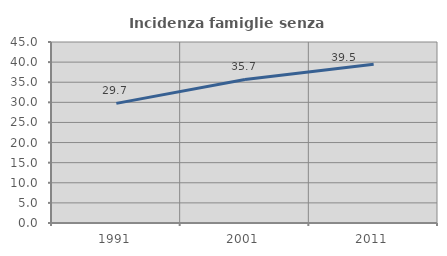
| Category | Incidenza famiglie senza nuclei |
|---|---|
| 1991.0 | 29.738 |
| 2001.0 | 35.695 |
| 2011.0 | 39.474 |